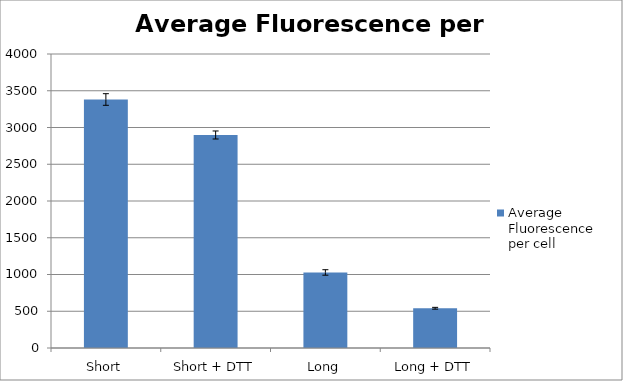
| Category | Average Fluorescence per cell |
|---|---|
| Short | 3381.069 |
| Short + DTT | 2898.205 |
| Long | 1027.863 |
| Long + DTT | 540.839 |